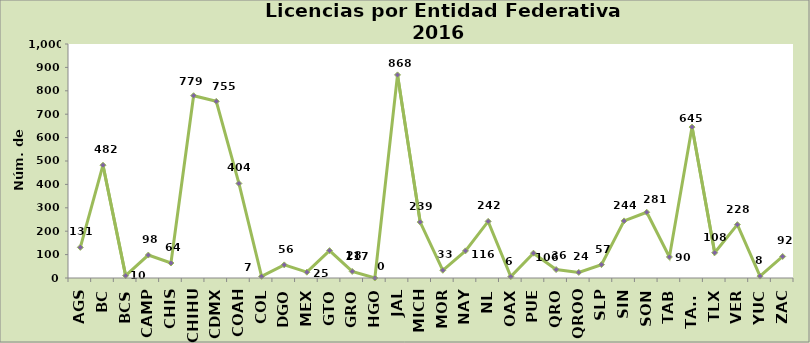
| Category | Series 0 |
|---|---|
| AGS | 131 |
| BC | 482 |
| BCS | 10 |
| CAMP | 98 |
| CHIS | 64 |
| CHIHU | 779 |
| CDMX | 755 |
| COAH | 404 |
| COL | 7 |
| DGO | 56 |
| MEX | 25 |
| GTO | 117 |
| GRO | 28 |
| HGO | 0 |
| JAL | 868 |
| MICH | 239 |
| MOR | 33 |
| NAY | 116 |
| NL | 242 |
| OAX | 6 |
| PUE | 106 |
| QRO | 36 |
| QROO | 24 |
| SLP | 57 |
| SIN | 244 |
| SON | 281 |
| TAB | 90 |
| TAMS | 645 |
| TLX | 108 |
| VER | 228 |
| YUC | 8 |
| ZAC | 92 |